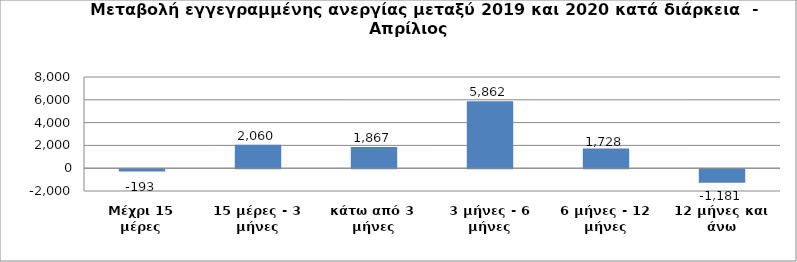
| Category | Series 0 |
|---|---|
| Μέχρι 15 μέρες | -193 |
| 15 μέρες - 3 μήνες | 2060 |
| κάτω από 3 μήνες | 1867 |
| 3 μήνες - 6 μήνες | 5862 |
| 6 μήνες - 12 μήνες | 1728 |
| 12 μήνες και άνω | -1181 |